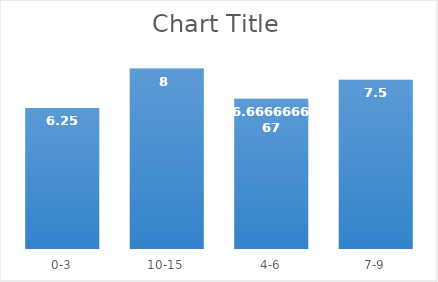
| Category | Series 0 |
|---|---|
| 0-3 | 6.25 |
| 10-15 | 8 |
| 4-6 | 6.667 |
| 7-9 | 7.5 |